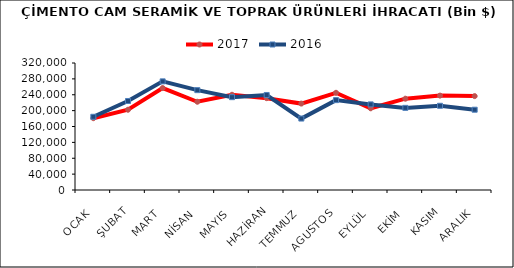
| Category | 2017 | 2016 |
|---|---|---|
| OCAK | 180944.359 | 184458.32 |
| ŞUBAT | 202276.773 | 224268.116 |
| MART | 256865.706 | 273738.899 |
| NİSAN | 222383.928 | 251577.991 |
| MAYIS | 239968.613 | 233936.514 |
| HAZİRAN | 231400.932 | 239411.145 |
| TEMMUZ | 217731.46 | 180023.774 |
| AGUSTOS | 244931.502 | 226448.756 |
| EYLÜL | 205876.789 | 215706.091 |
| EKİM | 230060.98 | 206936.048 |
| KASIM | 237813.472 | 212186.105 |
| ARALIK | 236565.199 | 202294.287 |